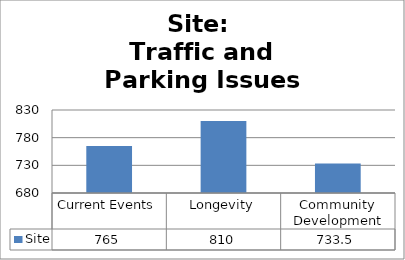
| Category | Site |
|---|---|
| Current Events | 765 |
| Longevity | 810 |
| Community Development | 733.5 |